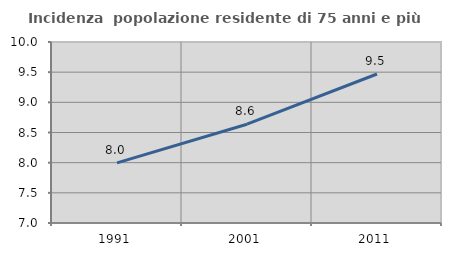
| Category | Incidenza  popolazione residente di 75 anni e più |
|---|---|
| 1991.0 | 7.996 |
| 2001.0 | 8.637 |
| 2011.0 | 9.47 |